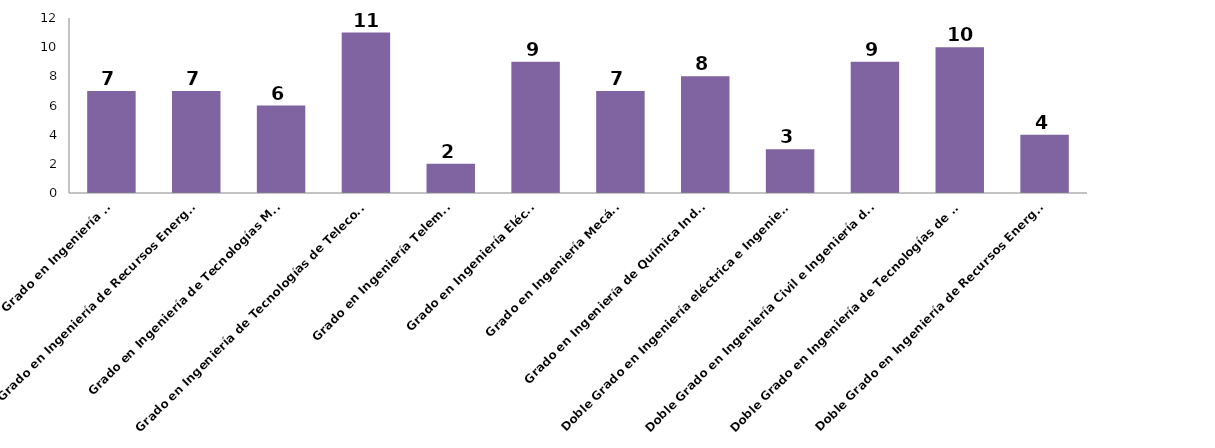
| Category | Series 0 |
|---|---|
| Grado en Ingeniería Civil | 7 |
| Grado en Ingeniería de Recursos Energéticos | 7 |
| Grado en Ingeniería de Tecnologías Mineras | 6 |
| Grado en Ingeniería de Tecnologías de Telecomunicación | 11 |
| Grado en Ingeniería Telemática | 2 |
| Grado en Ingeniería Eléctrica | 9 |
| Grado en Ingeniería Mecánica | 7 |
| Grado en Ingeniería de Química Industrial | 8 |
| Doble Grado en Ingeniería eléctrica e Ingeniería mecánica | 3 |
| Doble Grado en Ingeniería Civil e Ingeniería de Tecnologías Mineras | 9 |
| Doble Grado en Ingeniería de Tecnologías de Telecomunicación e Ingeniería Telemática | 10 |
| Doble Grado en Ingeniería de Recursos Energéticos e Ingeniería Química Industrial | 4 |